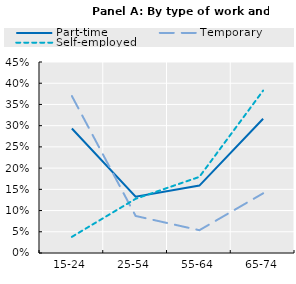
| Category | Part-time | Temporary | Self-employed |
|---|---|---|---|
| 15-24 | 0.293 | 0.37 | 0.038 |
| 25-54 | 0.133 | 0.087 | 0.128 |
| 55-64 | 0.159 | 0.054 | 0.179 |
| 65-74 | 0.316 | 0.141 | 0.383 |